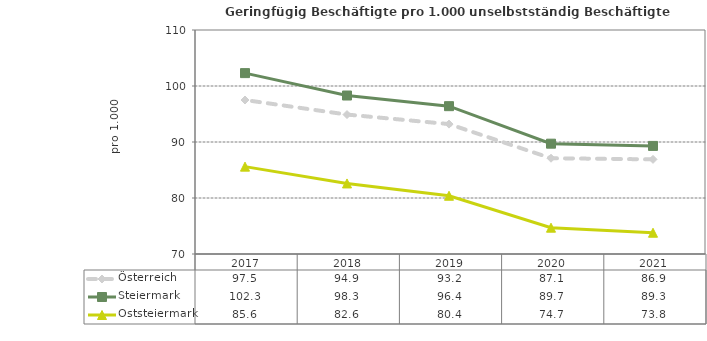
| Category | Österreich | Steiermark | Oststeiermark |
|---|---|---|---|
| 2021.0 | 86.9 | 89.3 | 73.8 |
| 2020.0 | 87.1 | 89.7 | 74.7 |
| 2019.0 | 93.2 | 96.4 | 80.4 |
| 2018.0 | 94.9 | 98.3 | 82.6 |
| 2017.0 | 97.5 | 102.3 | 85.6 |